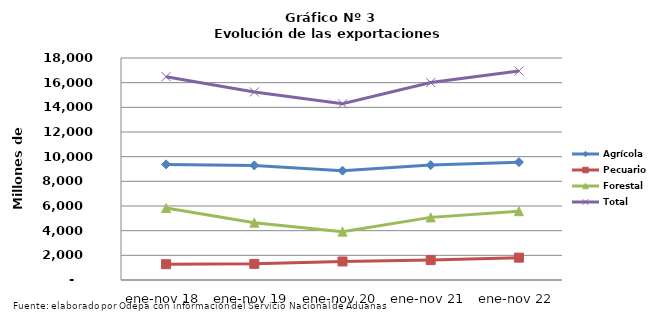
| Category | Agrícola | Pecuario | Forestal | Total |
|---|---|---|---|---|
| ene-nov 18 | 9374063 | 1280132 | 5831677 | 16485872 |
| ene-nov 19 | 9290757 | 1309674 | 4646052 | 15246483 |
| ene-nov 20 | 8861558 | 1502431 | 3921879 | 14285868 |
| ene-nov 21 | 9314532 | 1615024 | 5077645 | 16007201 |
| ene-nov 22 | 9555249 | 1810572 | 5579918 | 16945739 |